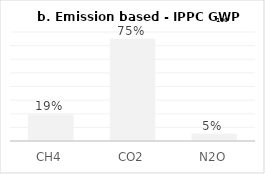
| Category | Series 0 |
|---|---|
| CH4 | 0.195 |
| CO2 | 0.751 |
| N2O | 0.054 |